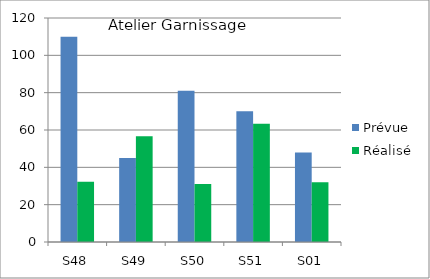
| Category | Prévue | Réalisé |
|---|---|---|
| S48 | 110 | 32.241 |
| S49 | 45 | 56.685 |
| S50 | 81 | 31.064 |
| S51 | 70 | 63.386 |
| S01 | 48 | 32 |